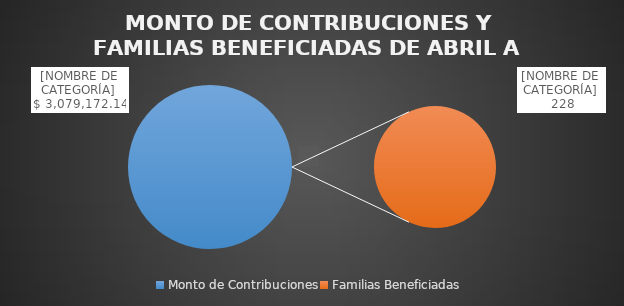
| Category | Series 0 |
|---|---|
| Monto de Contribuciones | 3079172.14 |
| Familias Beneficiadas | 228 |